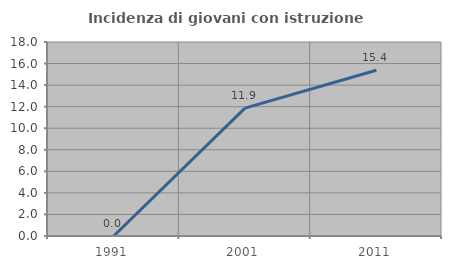
| Category | Incidenza di giovani con istruzione universitaria |
|---|---|
| 1991.0 | 0 |
| 2001.0 | 11.864 |
| 2011.0 | 15.385 |